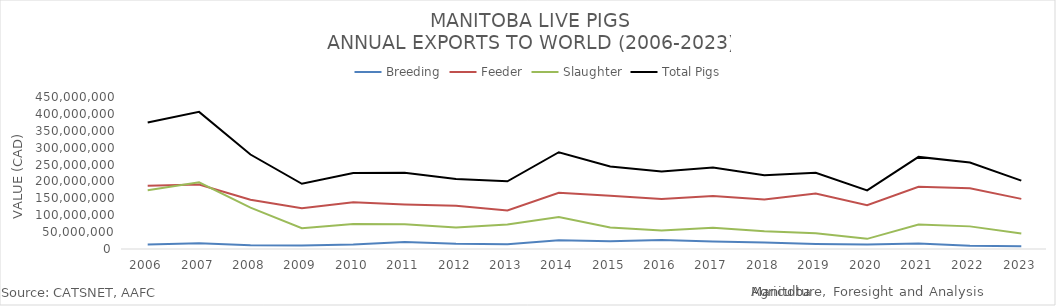
| Category | Breeding | Feeder | Slaughter | Total Pigs |
|---|---|---|---|---|
| 2006 | 13619409 | 186987471 | 173904277 | 374511157 |
| 2007 | 17315003 | 191080081 | 197553713 | 405948797 |
| 2008 | 11323160 | 145885944 | 122525909 | 279735013 |
| 2009 | 10369090 | 121022983 | 61596656 | 192988729 |
| 2010 | 13100711 | 138186659 | 73744012 | 225031382 |
| 2011 | 20804254 | 131622663 | 73556882 | 225983799 |
| 2012 | 15440498 | 128183546 | 63365682 | 206989726 |
| 2013 | 13858913 | 113823509 | 72828064 | 200510486 |
| 2014 | 25555040 | 166361332 | 94664149 | 286580521 |
| 2015 | 23305918 | 157421216 | 63611767 | 244338901 |
| 2016 | 26716022 | 148123598 | 54448265 | 229287885 |
| 2017 | 22179168 | 156586979 | 62787752 | 241553899 |
| 2018 | 19067053 | 146584255 | 52361032 | 218012340 |
| 2019 | 14921238 | 164041497 | 46800000 | 225762735 |
| 2020 | 13689209 | 129632278 | 30034105 | 173355592 |
| 2021 | 16201454 | 184004273 | 72437495 | 272643222 |
| 2022 | 9320616 | 179639885 | 66989136 | 255949637 |
| 2023 | 7885926 | 148444721 | 46086281 | 202416928 |